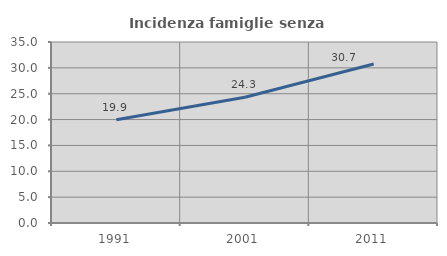
| Category | Incidenza famiglie senza nuclei |
|---|---|
| 1991.0 | 19.948 |
| 2001.0 | 24.312 |
| 2011.0 | 30.737 |